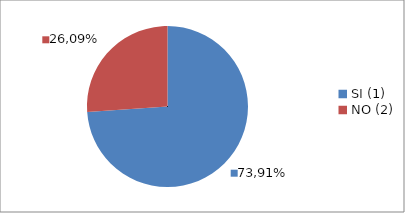
| Category | Series 0 |
|---|---|
| SI (1) | 0.739 |
| NO (2) | 0.261 |